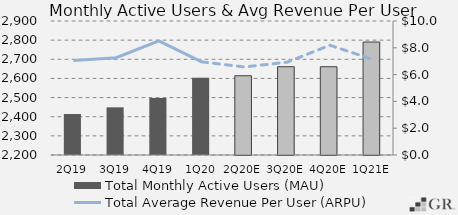
| Category | Total Monthly Active Users (MAU)  |
|---|---|
|  2Q19  | 2414 |
|  3Q19  | 2449 |
|  4Q19  | 2497.8 |
|  1Q20  | 2603 |
|  2Q20E  | 2613.962 |
|  3Q20E  | 2661.233 |
|  4Q20E  | 2661.039 |
|  1Q21E  | 2790.284 |